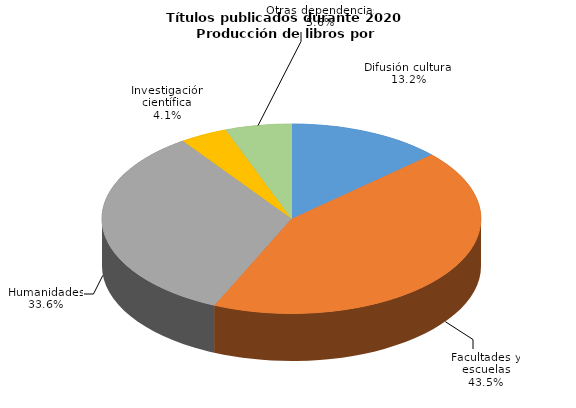
| Category | Series 0 |
|---|---|
| Difusión cultural | 208 |
| Facultades y escuelas | 685 |
| Humanidades | 530 |
| Investigación científica | 64 |
| Otras dependencias | 89 |